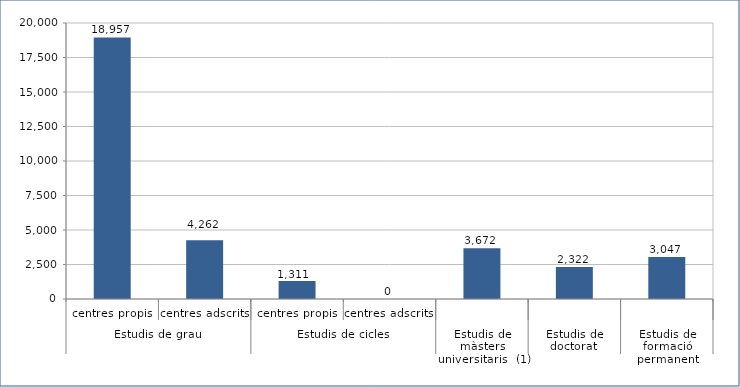
| Category | Series 0 |
|---|---|
| 0 | 18957 |
| 1 | 4262 |
| 2 | 1311 |
| 3 | 0 |
| 4 | 3672 |
| 5 | 2322 |
| 6 | 3047 |